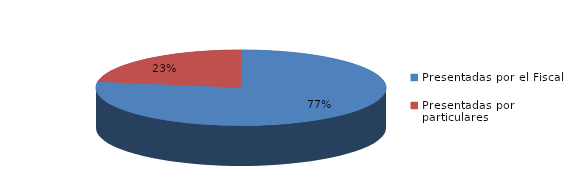
| Category | Series 0 |
|---|---|
| Presentadas por el Fiscal | 637 |
| Presentadas por particulares | 185 |